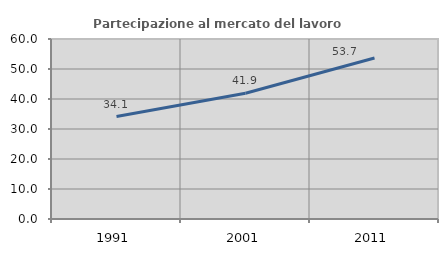
| Category | Partecipazione al mercato del lavoro  femminile |
|---|---|
| 1991.0 | 34.139 |
| 2001.0 | 41.918 |
| 2011.0 | 53.664 |